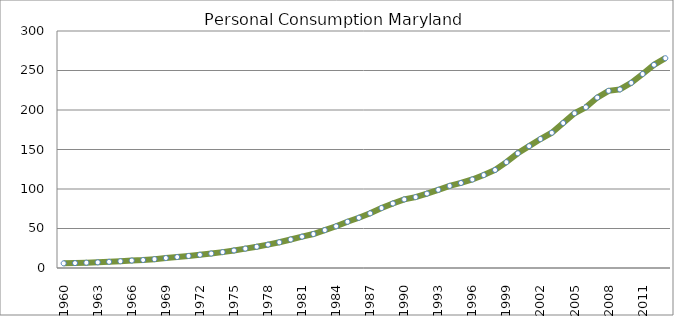
| Category | Series 0 |
|---|---|
| 1960.0 | 5.899 |
| 1961.0 | 6.202 |
| 1962.0 | 6.689 |
| 1963.0 | 7.181 |
| 1964.0 | 7.858 |
| 1965.0 | 8.57 |
| 1966.0 | 9.431 |
| 1967.0 | 10.117 |
| 1968.0 | 11.215 |
| 1969.0 | 12.618 |
| 1970.0 | 13.878 |
| 1971.0 | 15.258 |
| 1972.0 | 16.726 |
| 1973.0 | 18.306 |
| 1974.0 | 20.089 |
| 1975.0 | 22.193 |
| 1976.0 | 24.548 |
| 1977.0 | 26.852 |
| 1978.0 | 29.557 |
| 1979.0 | 32.554 |
| 1980.0 | 36.082 |
| 1981.0 | 39.652 |
| 1982.0 | 43.006 |
| 1983.0 | 47.94 |
| 1984.0 | 52.781 |
| 1985.0 | 58.542 |
| 1986.0 | 63.537 |
| 1987.0 | 69.206 |
| 1988.0 | 75.904 |
| 1989.0 | 81.653 |
| 1990.0 | 86.801 |
| 1991.0 | 89.732 |
| 1992.0 | 94.168 |
| 1993.0 | 98.968 |
| 1994.0 | 103.933 |
| 1995.0 | 107.625 |
| 1996.0 | 112.035 |
| 1997.0 | 117.641 |
| 1998.0 | 124.092 |
| 1999.0 | 133.959 |
| 2000.0 | 145.202 |
| 2001.0 | 154.235 |
| 2002.0 | 163.253 |
| 2003.0 | 171.204 |
| 2004.0 | 183.53 |
| 2005.0 | 195.919 |
| 2006.0 | 203.429 |
| 2007.0 | 215.722 |
| 2008.0 | 224.24 |
| 2009.0 | 226.022 |
| 2010.0 | 234.371 |
| 2011.0 | 245.567 |
| 2012.0 | 257.182 |
| 2013.0 | 265.568 |